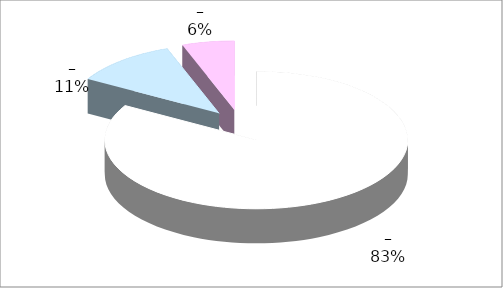
| Category | Series 0 |
|---|---|
| 0 | 15 |
| 1 | 2 |
| 2 | 1 |